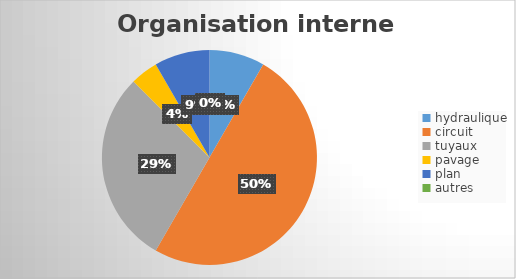
| Category | Series 0 |
|---|---|
| hydraulique | 2 |
| circuit | 12 |
| tuyaux | 7 |
| pavage | 1 |
| plan | 2 |
| autres | 0 |